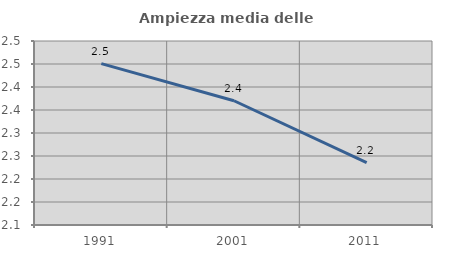
| Category | Ampiezza media delle famiglie |
|---|---|
| 1991.0 | 2.451 |
| 2001.0 | 2.37 |
| 2011.0 | 2.236 |